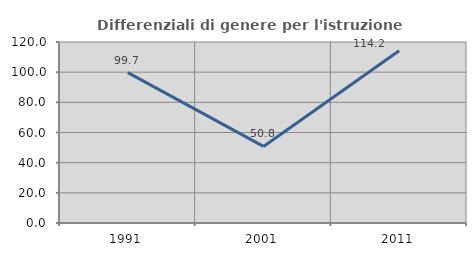
| Category | Differenziali di genere per l'istruzione superiore |
|---|---|
| 1991.0 | 99.668 |
| 2001.0 | 50.76 |
| 2011.0 | 114.248 |